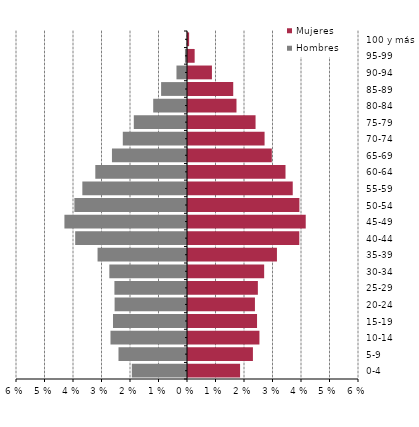
| Category | Hombres | Mujeres |
|---|---|---|
| 0-4 | -0.019 | 0.018 |
| 5-9 | -0.024 | 0.023 |
| 10-14 | -0.027 | 0.025 |
| 15-19 | -0.026 | 0.024 |
| 20-24 | -0.025 | 0.023 |
| 25-29 | -0.025 | 0.025 |
| 30-34 | -0.027 | 0.027 |
| 35-39 | -0.031 | 0.031 |
| 40-44 | -0.039 | 0.039 |
| 45-49 | -0.043 | 0.041 |
| 50-54 | -0.04 | 0.039 |
| 55-59 | -0.037 | 0.037 |
| 60-64 | -0.032 | 0.034 |
| 65-69 | -0.026 | 0.029 |
| 70-74 | -0.023 | 0.027 |
| 75-79 | -0.019 | 0.024 |
| 80-84 | -0.012 | 0.017 |
| 85-89 | -0.009 | 0.016 |
| 90-94 | -0.004 | 0.008 |
| 95-99 | -0.001 | 0.002 |
| 100 y más | 0 | 0 |